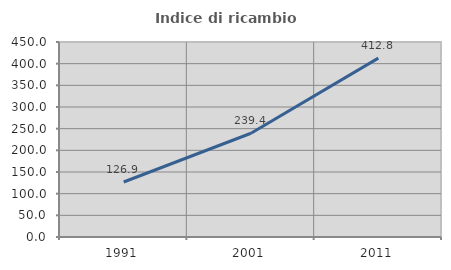
| Category | Indice di ricambio occupazionale  |
|---|---|
| 1991.0 | 126.923 |
| 2001.0 | 239.394 |
| 2011.0 | 412.8 |